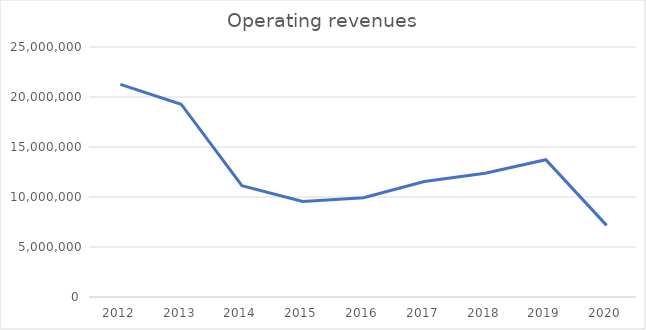
| Category | Operating revenues |
|---|---|
| 2012.0 | 21259798.223 |
| 2013.0 | 19279720.863 |
| 2014.0 | 11141711.841 |
| 2015.0 | 9546354.194 |
| 2016.0 | 9921456.645 |
| 2017.0 | 11540446.844 |
| 2018.0 | 12382603.387 |
| 2019.0 | 13725530.52 |
| 2020.0 | 7163895.887 |